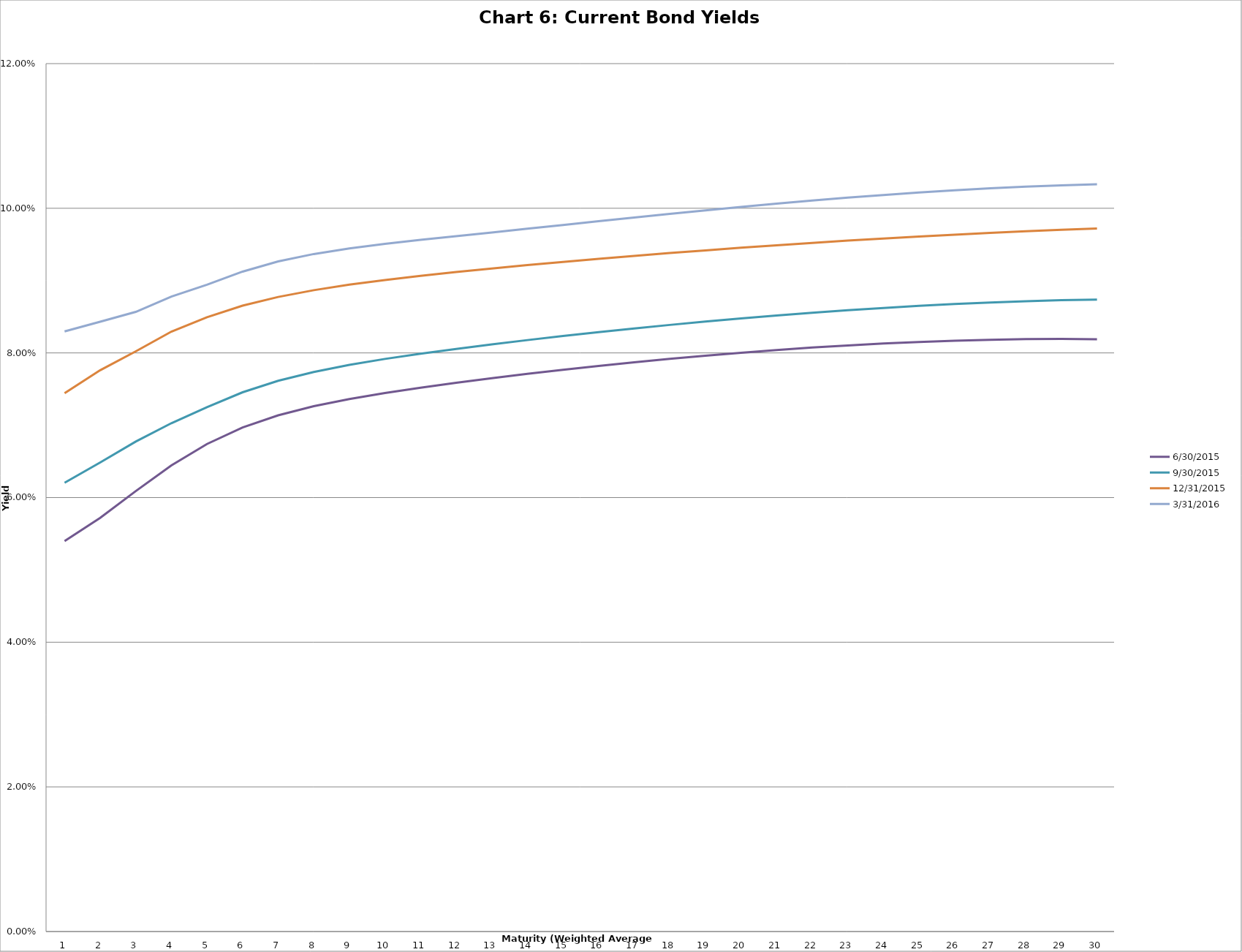
| Category | 6/30/2015 | 9/30/2015 | 12/31/2015 | 3/31/2016 |
|---|---|---|---|---|
| 0 | 0.054 | 0.062 | 0.074 | 0.083 |
| 1 | 0.057 | 0.065 | 0.078 | 0.084 |
| 2 | 0.061 | 0.068 | 0.08 | 0.086 |
| 3 | 0.064 | 0.07 | 0.083 | 0.088 |
| 4 | 0.067 | 0.072 | 0.085 | 0.089 |
| 5 | 0.07 | 0.075 | 0.087 | 0.091 |
| 6 | 0.071 | 0.076 | 0.088 | 0.093 |
| 7 | 0.073 | 0.077 | 0.089 | 0.094 |
| 8 | 0.074 | 0.078 | 0.089 | 0.094 |
| 9 | 0.074 | 0.079 | 0.09 | 0.095 |
| 10 | 0.075 | 0.08 | 0.091 | 0.096 |
| 11 | 0.076 | 0.081 | 0.091 | 0.096 |
| 12 | 0.076 | 0.081 | 0.092 | 0.097 |
| 13 | 0.077 | 0.082 | 0.092 | 0.097 |
| 14 | 0.078 | 0.082 | 0.093 | 0.098 |
| 15 | 0.078 | 0.083 | 0.093 | 0.098 |
| 16 | 0.079 | 0.083 | 0.093 | 0.099 |
| 17 | 0.079 | 0.084 | 0.094 | 0.099 |
| 18 | 0.08 | 0.084 | 0.094 | 0.1 |
| 19 | 0.08 | 0.085 | 0.095 | 0.1 |
| 20 | 0.08 | 0.085 | 0.095 | 0.101 |
| 21 | 0.081 | 0.086 | 0.095 | 0.101 |
| 22 | 0.081 | 0.086 | 0.096 | 0.101 |
| 23 | 0.081 | 0.086 | 0.096 | 0.102 |
| 24 | 0.082 | 0.087 | 0.096 | 0.102 |
| 25 | 0.082 | 0.087 | 0.096 | 0.102 |
| 26 | 0.082 | 0.087 | 0.097 | 0.103 |
| 27 | 0.082 | 0.087 | 0.097 | 0.103 |
| 28 | 0.082 | 0.087 | 0.097 | 0.103 |
| 29 | 0.082 | 0.087 | 0.097 | 0.103 |